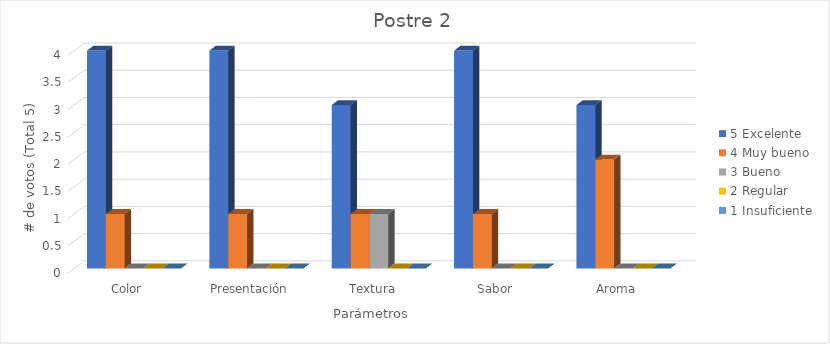
| Category | 5 | 4 | 3 | 2 | 1 |
|---|---|---|---|---|---|
| Color | 4 | 1 | 0 | 0 | 0 |
| Presentación | 4 | 1 | 0 | 0 | 0 |
| Textura | 3 | 1 | 1 | 0 | 0 |
| Sabor | 4 | 1 | 0 | 0 | 0 |
| Aroma | 3 | 2 | 0 | 0 | 0 |